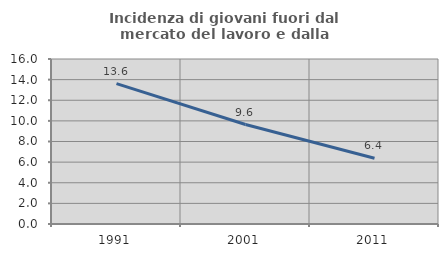
| Category | Incidenza di giovani fuori dal mercato del lavoro e dalla formazione  |
|---|---|
| 1991.0 | 13.617 |
| 2001.0 | 9.645 |
| 2011.0 | 6.383 |